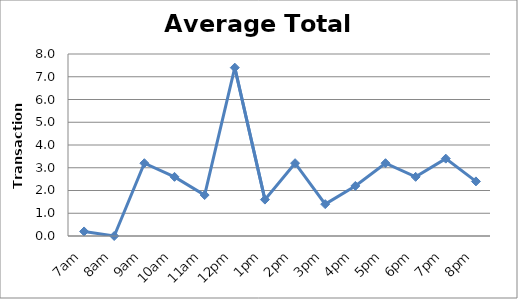
| Category | Transactions |
|---|---|
| 7am | 0.2 |
| 8am | 0 |
| 9am | 3.2 |
| 10am | 2.6 |
| 11am | 1.8 |
| 12pm | 7.4 |
| 1pm | 1.6 |
| 2pm | 3.2 |
| 3pm | 1.4 |
| 4pm | 2.2 |
| 5pm | 3.2 |
| 6pm | 2.6 |
| 7pm | 3.4 |
| 8pm | 2.4 |